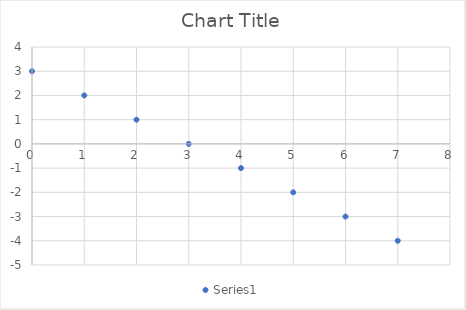
| Category | Series 0 |
|---|---|
| 0.0 | 3 |
| 1.0 | 2 |
| 2.0 | 1 |
| 3.0 | 0 |
| 4.0 | -1 |
| 5.0 | -2 |
| 6.0 | -3 |
| 7.0 | -4 |